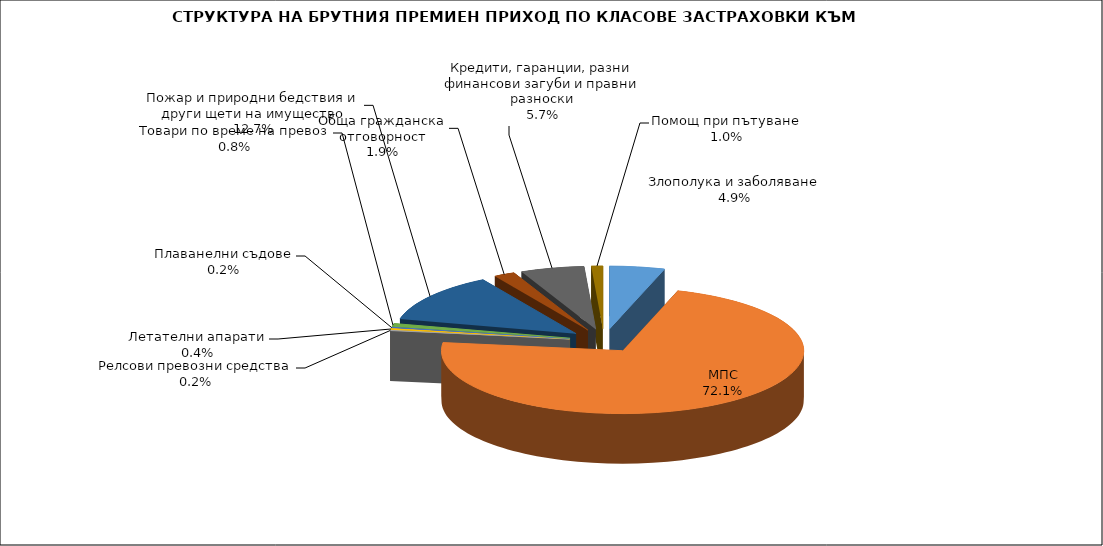
| Category | Злополука и заболяване |
|---|---|
| Злополука и заболяване | 0.049 |
| МПС | 0.721 |
| Релсови превозни средства | 0.002 |
| Летателни апарати | 0.004 |
| Плаванелни съдове | 0.002 |
| Товари по време на превоз | 0.008 |
| Пожар и природни бедствия и други щети на имущество | 0.127 |
| Обща гражданска отговорност | 0.019 |
| Кредити, гаранции, разни финансови загуби и правни разноски | 0.057 |
| Помощ при пътуване | 0.01 |